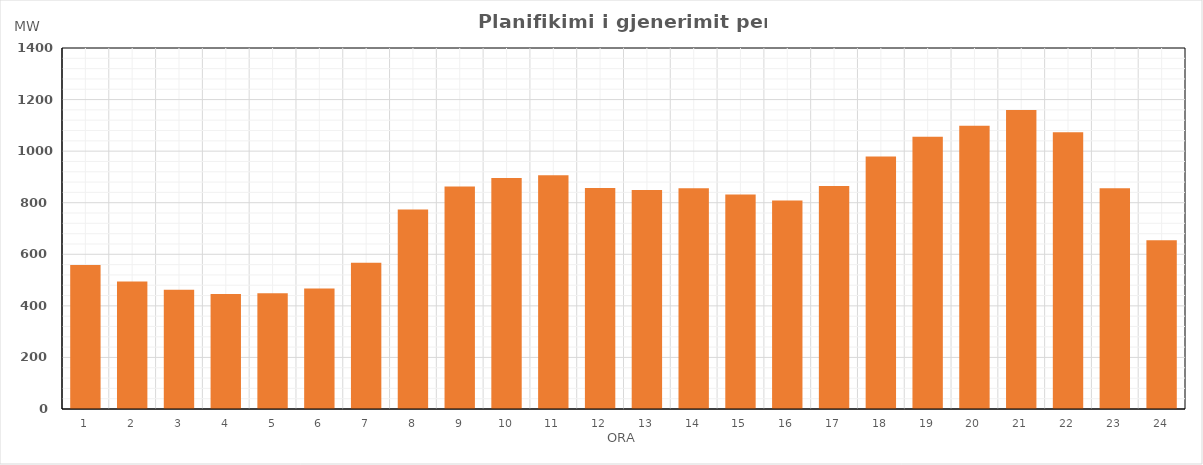
| Category | Max (MW) |
|---|---|
| 0 | 558.54 |
| 1 | 494.86 |
| 2 | 462.14 |
| 3 | 446.22 |
| 4 | 448.84 |
| 5 | 467.22 |
| 6 | 566.76 |
| 7 | 773.74 |
| 8 | 863.24 |
| 9 | 895.65 |
| 10 | 906.05 |
| 11 | 856.92 |
| 12 | 849.34 |
| 13 | 856.01 |
| 14 | 831.61 |
| 15 | 808.69 |
| 16 | 865 |
| 17 | 978.92 |
| 18 | 1055.52 |
| 19 | 1098.36 |
| 20 | 1159.1 |
| 21 | 1073.67 |
| 22 | 856.16 |
| 23 | 654.53 |